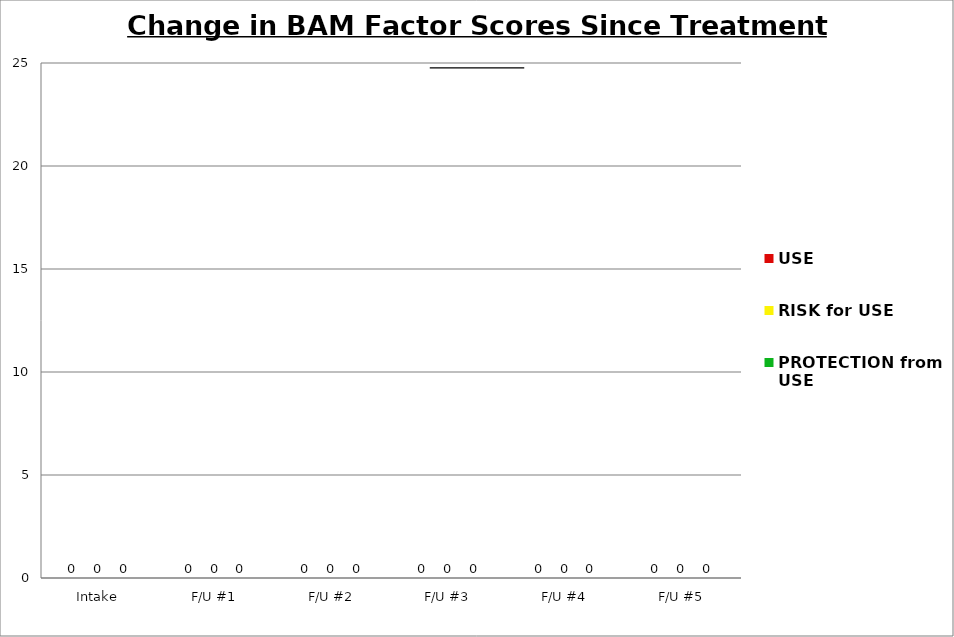
| Category | USE | RISK for USE | PROTECTION from USE |
|---|---|---|---|
| Intake | 0 | 0 | 0 |
| F/U #1 | 0 | 0 | 0 |
| F/U #2 | 0 | 0 | 0 |
| F/U #3 | 0 | 0 | 0 |
| F/U #4 | 0 | 0 | 0 |
| F/U #5 | 0 | 0 | 0 |